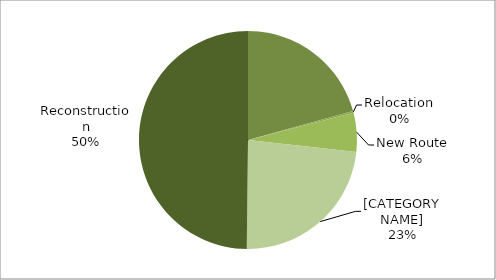
| Category | Series 0 |
|---|---|
| Restoration & Rehab. | 0.207 |
| Relocation | 0.003 |
| New Route | 0.058 |
| Resurfacing | 0.234 |
| Reconstruction | 0.498 |